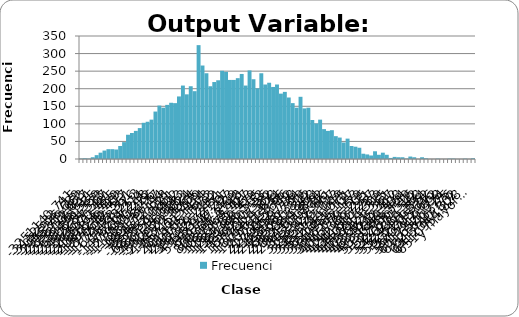
| Category | Frecuencia |
|---|---|
| -3251140,74 | 1 |
| -3152533,71 | 2 |
| -3053926,69 | 1 |
| -2955319,66 | 5 |
| -2856712,64 | 11 |
| -2758105,61 | 18 |
| -2659498,58 | 24 |
| -2560891,56 | 28 |
| -2462284,53 | 28 |
| -2363677,51 | 27 |
| -2265070,48 | 37 |
| -2166463,46 | 48 |
| -2067856,43 | 69 |
| -1969249,40 | 74 |
| -1870642,38 | 80 |
| -1772035,35 | 88 |
| -1673428,33 | 103 |
| -1574821,30 | 106 |
| -1476214,27 | 112 |
| -1377607,25 | 135 |
| -1279000,22 | 152 |
| -1180393,20 | 146 |
| -1081786,17 | 154 |
| -983179,14 | 160 |
| -884572,12 | 159 |
| -785965,09 | 178 |
| -687358,07 | 209 |
| -588751,04 | 184 |
| -490144,01 | 207 |
| -391536,99 | 193 |
| -292929,96 | 324 |
| -194322,94 | 266 |
| -95715,91 | 244 |
| 2891,12 | 207 |
| 101498,14 | 219 |
| 200105,17 | 224 |
| 298712,19 | 251 |
| 397319,22 | 248 |
| 495926,25 | 225 |
| 594533,27 | 225 |
| 693140,30 | 230 |
| 791747,32 | 242 |
| 890354,35 | 209 |
| 988961,37 | 252 |
| 1087568,40 | 227 |
| 1186175,43 | 201 |
| 1284782,45 | 244 |
| 1383389,48 | 212 |
| 1481996,50 | 217 |
| 1580603,53 | 205 |
| 1679210,56 | 212 |
| 1777817,58 | 186 |
| 1876424,61 | 191 |
| 1975031,63 | 175 |
| 2073638,66 | 159 |
| 2172245,69 | 146 |
| 2270852,71 | 177 |
| 2369459,74 | 144 |
| 2468066,76 | 146 |
| 2566673,79 | 111 |
| 2665280,82 | 101 |
| 2763887,84 | 112 |
| 2862494,87 | 85 |
| 2961101,89 | 80 |
| 3059708,92 | 82 |
| 3158315,95 | 65 |
| 3256922,97 | 61 |
| 3355530,00 | 47 |
| 3454137,02 | 58 |
| 3552744,05 | 37 |
| 3651351,08 | 35 |
| 3749958,10 | 32 |
| 3848565,13 | 15 |
| 3947172,15 | 13 |
| 4045779,18 | 10 |
| 4144386,20 | 22 |
| 4242993,23 | 12 |
| 4341600,26 | 18 |
| 4440207,28 | 12 |
| 4538814,31 | 3 |
| 4637421,33 | 6 |
| 4736028,36 | 5 |
| 4834635,39 | 5 |
| 4933242,41 | 1 |
| 5031849,44 | 7 |
| 5130456,46 | 5 |
| 5229063,49 | 0 |
| 5327670,52 | 5 |
| 5426277,54 | 2 |
| 5524884,57 | 0 |
| 5623491,59 | 0 |
| 5722098,62 | 1 |
| 5820705,65 | 0 |
| 5919312,67 | 0 |
| 6017919,70 | 1 |
| 6116526,72 | 1 |
| 6215133,75 | 0 |
| 6313740,78 | 0 |
| 6412347,80 | 1 |
| 6510954,83 | 0 |
| y mayor... | 2 |